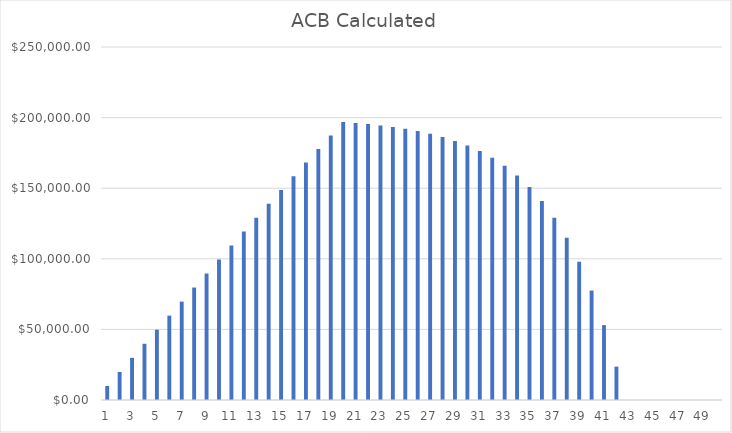
| Category | ACB Calculated |
|---|---|
| 0 | 9900 |
| 1 | 19880 |
| 2 | 29856 |
| 3 | 39827.2 |
| 4 | 49792.64 |
| 5 | 59751.168 |
| 6 | 69701.402 |
| 7 | 79641.682 |
| 8 | 89570.018 |
| 9 | 99484.022 |
| 10 | 109380.826 |
| 11 | 119256.992 |
| 12 | 129108.39 |
| 13 | 138930.068 |
| 14 | 148716.082 |
| 15 | 158459.298 |
| 16 | 168151.157 |
| 17 | 177781.389 |
| 18 | 187337.667 |
| 19 | 196805.2 |
| 20 | 196166.24 |
| 21 | 195399.488 |
| 22 | 194479.386 |
| 23 | 193375.263 |
| 24 | 192050.315 |
| 25 | 190460.378 |
| 26 | 188552.454 |
| 27 | 186262.945 |
| 28 | 183515.534 |
| 29 | 180218.641 |
| 30 | 176262.369 |
| 31 | 171514.842 |
| 32 | 165817.811 |
| 33 | 158981.373 |
| 34 | 150777.648 |
| 35 | 140933.177 |
| 36 | 129119.813 |
| 37 | 114943.775 |
| 38 | 97932.53 |
| 39 | 77519.036 |
| 40 | 53022.843 |
| 41 | 23627.412 |
| 42 | 0 |
| 43 | 0 |
| 44 | 0 |
| 45 | 0 |
| 46 | 0 |
| 47 | 0 |
| 48 | 0 |
| 49 | 0 |